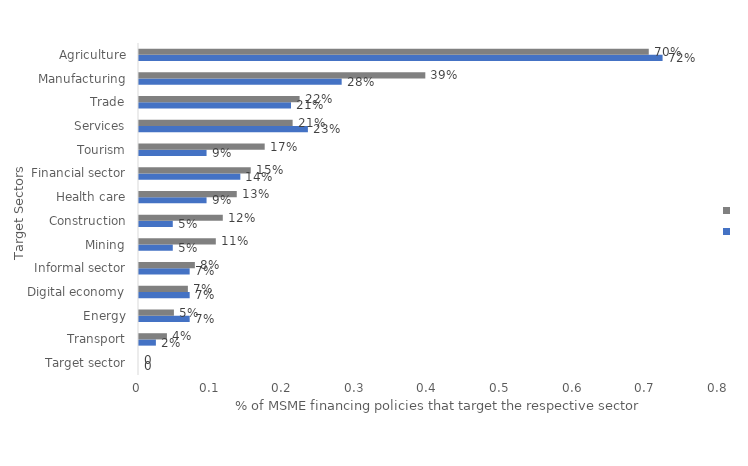
| Category | Series 0 | Series 1 |
|---|---|---|
| Target sector | 0 | 0 |
| Transport | 0.023 | 0.038 |
| Energy | 0.07 | 0.048 |
| Digital economy | 0.07 | 0.067 |
| Informal sector | 0.07 | 0.077 |
| Mining | 0.047 | 0.106 |
| Construction | 0.047 | 0.115 |
| Health care | 0.093 | 0.135 |
| Financial sector | 0.14 | 0.154 |
| Tourism | 0.093 | 0.173 |
| Services | 0.233 | 0.212 |
| Trade | 0.209 | 0.221 |
| Manufacturing | 0.279 | 0.394 |
| Agriculture | 0.721 | 0.702 |